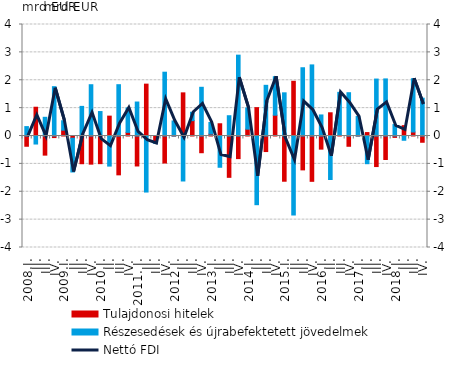
| Category | Tulajdonosi hitelek | Részesedések és újrabefektetett jövedelmek |
|---|---|---|
| 2008.I. | -0.368 | 0.337 |
| II. | 1.032 | -0.288 |
| III. | -0.686 | 0.671 |
| IV. | -0.057 | 1.77 |
| 2009.I. | 0.209 | 0.337 |
| II. | -0.079 | -1.212 |
| III. | -0.994 | 1.062 |
| IV. | -1.01 | 1.84 |
| 2010.I. | -0.992 | 0.877 |
| II. | 0.713 | -1.08 |
| III. | -1.394 | 1.841 |
| IV. | 0.13 | 0.876 |
| 2011. I. | -1.075 | 1.219 |
| II. | 1.86 | -2.011 |
| III. | -0.2 | -0.067 |
| IV. | -0.969 | 2.289 |
| 2012.I. | -0.004 | 0.539 |
| II. | 1.548 | -1.614 |
| III. | 0.552 | 0.3 |
| IV. | -0.6 | 1.748 |
| 2013.I. | 0.07 | 0.416 |
| II. | 0.439 | -1.121 |
| III. | -1.483 | 0.727 |
| IV. | -0.811 | 2.9 |
| 2014.I. | 0.246 | 0.762 |
| II. | 1.018 | -2.464 |
| III. | -0.558 | 1.818 |
| IV. | 0.746 | 1.38 |
| 2015.I. | -1.622 | 1.549 |
| II. | 1.963 | -2.834 |
| III. | -1.215 | 2.449 |
| IV. | -1.626 | 2.551 |
| 2016.I. | -0.471 | 0.755 |
| II. | 0.833 | -1.561 |
| III. | 0.022 | 1.544 |
| IV. | -0.369 | 1.553 |
| 2017.I. | -0.003 | 0.7 |
| II. | 0.123 | -0.994 |
| III. | -1.096 | 2.043 |
| IV. | -0.842 | 2.048 |
| 2018.I. | -0.05 | 0.41 |
| II. | 0.371 | -0.153 |
| III. | 0.144 | 1.911 |
| IV. | -0.225 | 1.356 |